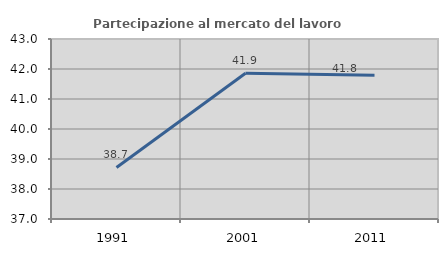
| Category | Partecipazione al mercato del lavoro  femminile |
|---|---|
| 1991.0 | 38.719 |
| 2001.0 | 41.86 |
| 2011.0 | 41.789 |